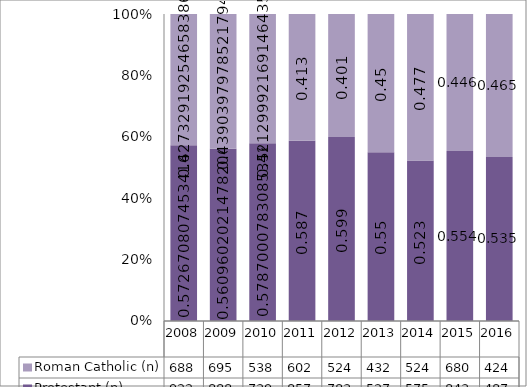
| Category | Protestant (n) | Roman Catholic (n) |
|---|---|---|
| 2008.0 | 922 | 688 |
| 2009.0 | 888 | 695 |
| 2010.0 | 739 | 538 |
| 2011.0 | 857 | 602 |
| 2012.0 | 783 | 524 |
| 2013.0 | 527 | 432 |
| 2014.0 | 575 | 524 |
| 2015.0 | 843 | 680 |
| 2016.0 | 487 | 424 |